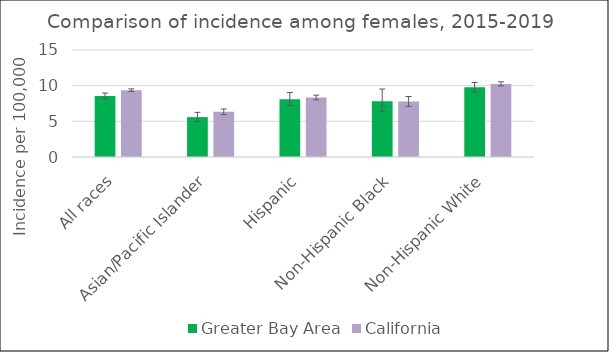
| Category | Greater Bay Area | California | SEER 18 |
|---|---|---|---|
| All races | 8.55 | 9.37 |  |
| Asian/Pacific Islander | 5.59 | 6.33 |  |
| Hispanic | 8.08 | 8.34 |  |
| Non-Hispanic Black | 7.81 | 7.77 |  |
| Non-Hispanic White | 9.77 | 10.25 |  |